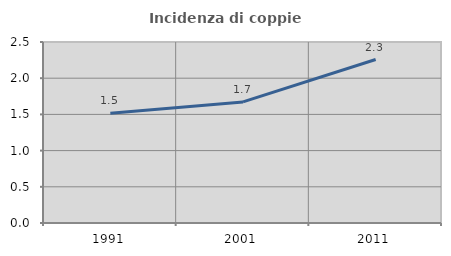
| Category | Incidenza di coppie miste |
|---|---|
| 1991.0 | 1.515 |
| 2001.0 | 1.672 |
| 2011.0 | 2.258 |